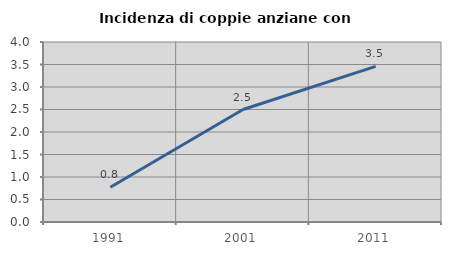
| Category | Incidenza di coppie anziane con figli |
|---|---|
| 1991.0 | 0.771 |
| 2001.0 | 2.5 |
| 2011.0 | 3.46 |